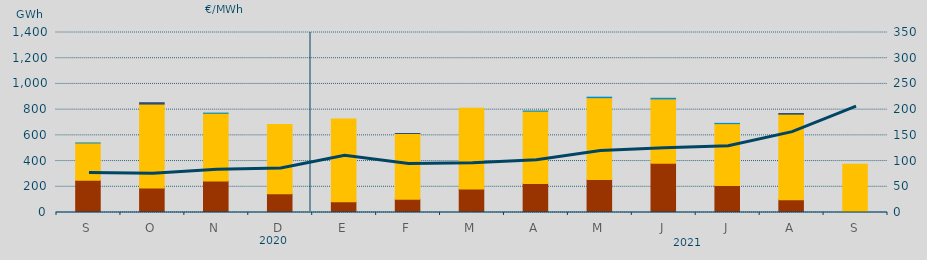
| Category | Carbón | Ciclo Combinado | Consumo Bombeo | Cogeneración | Hidráulica |
|---|---|---|---|---|---|
| S | 250957 | 289538.3 | 0 | 0 | 33.4 |
| O | 189825 | 653476.1 | 10686 | 0 | 0 |
| N | 244862 | 526555 | 0 | 0 | 1376.6 |
| D | 145998 | 537825.1 | 0 | 0 | 0 |
| E | 82898 | 644611.7 | 0 | 0 | 0 |
| F | 103840 | 510673.9 | 0 | 28 | 0 |
| M | 182851 | 627886.9 | 0 | 0 | 0 |
| A | 225243 | 562620.7 | 0 | 0 | 1232 |
| M | 257359 | 635666.9 | 0 | 0 | 3977.2 |
| J | 383637 | 499983.7 | 0 | 0 | 4778.5 |
| J | 210445 | 480749.8 | 0 | 0 | 1914.7 |
| A | 99208.5 | 665537.8 | 5384.9 | 0 | 0 |
| S | 634 | 375205.9 | 0 | 0 | 0 |